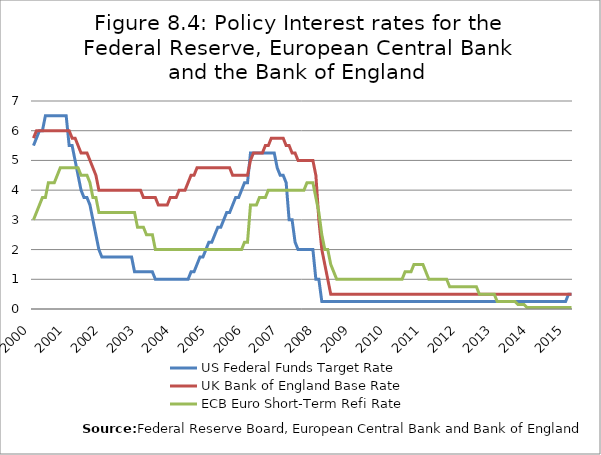
| Category | US Federal Funds Target Rate  | UK Bank of England Base Rate  | ECB Euro Short-Term Refi Rate   |
|---|---|---|---|
| 2000 | 5.5 | 5.75 | 3 |
| 2000 | 5.75 | 6 | 3.25 |
| 2000 | 6 | 6 | 3.5 |
| 2000 | 6 | 6 | 3.75 |
| 2000 | 6.5 | 6 | 3.75 |
| 2000 | 6.5 | 6 | 4.25 |
| 2000 | 6.5 | 6 | 4.25 |
| 2000 | 6.5 | 6 | 4.25 |
| 2000 | 6.5 | 6 | 4.5 |
| 2000 | 6.5 | 6 | 4.75 |
| 2000 | 6.5 | 6 | 4.75 |
| 2000 | 6.5 | 6 | 4.75 |
| 2001 | 5.5 | 6 | 4.75 |
| 2001 | 5.5 | 5.75 | 4.75 |
| 2001 | 5 | 5.75 | 4.75 |
| 2001 | 4.5 | 5.5 | 4.75 |
| 2001 | 4 | 5.25 | 4.5 |
| 2001 | 3.75 | 5.25 | 4.5 |
| 2001 | 3.75 | 5.25 | 4.5 |
| 2001 | 3.5 | 5 | 4.25 |
| 2001 | 3 | 4.75 | 3.75 |
| 2001 | 2.5 | 4.5 | 3.75 |
| 2001 | 2 | 4 | 3.25 |
| 2001 | 1.75 | 4 | 3.25 |
| 2002 | 1.75 | 4 | 3.25 |
| 2002 | 1.75 | 4 | 3.25 |
| 2002 | 1.75 | 4 | 3.25 |
| 2002 | 1.75 | 4 | 3.25 |
| 2002 | 1.75 | 4 | 3.25 |
| 2002 | 1.75 | 4 | 3.25 |
| 2002 | 1.75 | 4 | 3.25 |
| 2002 | 1.75 | 4 | 3.25 |
| 2002 | 1.75 | 4 | 3.25 |
| 2002 | 1.75 | 4 | 3.25 |
| 2002 | 1.25 | 4 | 3.25 |
| 2002 | 1.25 | 4 | 2.75 |
| 2003 | 1.25 | 4 | 2.75 |
| 2003 | 1.25 | 3.75 | 2.75 |
| 2003 | 1.25 | 3.75 | 2.5 |
| 2003 | 1.25 | 3.75 | 2.5 |
| 2003 | 1.25 | 3.75 | 2.5 |
| 2003 | 1 | 3.75 | 2 |
| 2003 | 1 | 3.5 | 2 |
| 2003 | 1 | 3.5 | 2 |
| 2003 | 1 | 3.5 | 2 |
| 2003 | 1 | 3.5 | 2 |
| 2003 | 1 | 3.75 | 2 |
| 2003 | 1 | 3.75 | 2 |
| 2004 | 1 | 3.75 | 2 |
| 2004 | 1 | 4 | 2 |
| 2004 | 1 | 4 | 2 |
| 2004 | 1 | 4 | 2 |
| 2004 | 1 | 4.25 | 2 |
| 2004 | 1.25 | 4.5 | 2 |
| 2004 | 1.25 | 4.5 | 2 |
| 2004 | 1.5 | 4.75 | 2 |
| 2004 | 1.75 | 4.75 | 2 |
| 2004 | 1.75 | 4.75 | 2 |
| 2004 | 2 | 4.75 | 2 |
| 2004 | 2.25 | 4.75 | 2 |
| 2005 | 2.25 | 4.75 | 2 |
| 2005 | 2.5 | 4.75 | 2 |
| 2005 | 2.75 | 4.75 | 2 |
| 2005 | 2.75 | 4.75 | 2 |
| 2005 | 3 | 4.75 | 2 |
| 2005 | 3.25 | 4.75 | 2 |
| 2005 | 3.25 | 4.75 | 2 |
| 2005 | 3.5 | 4.5 | 2 |
| 2005 | 3.75 | 4.5 | 2 |
| 2005 | 3.75 | 4.5 | 2 |
| 2005 | 4 | 4.5 | 2 |
| 2005 | 4.25 | 4.5 | 2.25 |
| 2006 | 4.25 | 4.5 | 2.25 |
| 2006 | 5.25 | 5 | 3.5 |
| 2007 | 5.25 | 5.25 | 3.5 |
| 2007 | 5.25 | 5.25 | 3.5 |
| 2007 | 5.25 | 5.25 | 3.75 |
| 2007 | 5.25 | 5.25 | 3.75 |
| 2007 | 5.25 | 5.5 | 3.75 |
| 2007 | 5.25 | 5.5 | 4 |
| 2007 | 5.25 | 5.75 | 4 |
| 2007 | 5.25 | 5.75 | 4 |
| 2007 | 4.75 | 5.75 | 4 |
| 2007 | 4.5 | 5.75 | 4 |
| 2007 | 4.5 | 5.75 | 4 |
| 2007 | 4.25 | 5.5 | 4 |
| 2008 | 3 | 5.5 | 4 |
| 2008 | 3 | 5.25 | 4 |
| 2008 | 2.25 | 5.25 | 4 |
| 2008 | 2 | 5 | 4 |
| 2008 | 2 | 5 | 4 |
| 2008 | 2 | 5 | 4 |
| 2008 | 2 | 5 | 4.25 |
| 2008 | 2 | 5 | 4.25 |
| 2008 | 2 | 5 | 4.25 |
| 2008 | 1 | 4.5 | 3.75 |
| 2008 | 1 | 3 | 3.25 |
| 2008 | 0.25 | 2 | 2.5 |
| 2009 | 0.25 | 1.5 | 2 |
| 2009 | 0.25 | 1 | 2 |
| 2009 | 0.25 | 0.5 | 1.5 |
| 2009 | 0.25 | 0.5 | 1.25 |
| 2009 | 0.25 | 0.5 | 1 |
| 2009 | 0.25 | 0.5 | 1 |
| 2009 | 0.25 | 0.5 | 1 |
| 2009 | 0.25 | 0.5 | 1 |
| 2009 | 0.25 | 0.5 | 1 |
| 2009 | 0.25 | 0.5 | 1 |
| 2009 | 0.25 | 0.5 | 1 |
| 2009 | 0.25 | 0.5 | 1 |
| 2010 | 0.25 | 0.5 | 1 |
| 2010 | 0.25 | 0.5 | 1 |
| 2010 | 0.25 | 0.5 | 1 |
| 2010 | 0.25 | 0.5 | 1 |
| 2010 | 0.25 | 0.5 | 1 |
| 2010 | 0.25 | 0.5 | 1 |
| 2010 | 0.25 | 0.5 | 1 |
| 2010 | 0.25 | 0.5 | 1 |
| 2010 | 0.25 | 0.5 | 1 |
| 2010 | 0.25 | 0.5 | 1 |
| 2010 | 0.25 | 0.5 | 1 |
| 2010 | 0.25 | 0.5 | 1 |
| 2011 | 0.25 | 0.5 | 1 |
| 2011 | 0.25 | 0.5 | 1 |
| 2011 | 0.25 | 0.5 | 1 |
| 2011 | 0.25 | 0.5 | 1.25 |
| 2011 | 0.25 | 0.5 | 1.25 |
| 2011 | 0.25 | 0.5 | 1.25 |
| 2011 | 0.25 | 0.5 | 1.5 |
| 2011 | 0.25 | 0.5 | 1.5 |
| 2011 | 0.25 | 0.5 | 1.5 |
| 2011 | 0.25 | 0.5 | 1.5 |
| 2011 | 0.25 | 0.5 | 1.25 |
| 2011 | 0.25 | 0.5 | 1 |
| 2012 | 0.25 | 0.5 | 1 |
| 2012 | 0.25 | 0.5 | 1 |
| 2012 | 0.25 | 0.5 | 1 |
| 2012 | 0.25 | 0.5 | 1 |
| 2012 | 0.25 | 0.5 | 1 |
| 2012 | 0.25 | 0.5 | 1 |
| 2012 | 0.25 | 0.5 | 0.75 |
| 2012 | 0.25 | 0.5 | 0.75 |
| 2012 | 0.25 | 0.5 | 0.75 |
| 2012 | 0.25 | 0.5 | 0.75 |
| 2012 | 0.25 | 0.5 | 0.75 |
| 2012 | 0.25 | 0.5 | 0.75 |
| 2013 | 0.25 | 0.5 | 0.75 |
| 2013 | 0.25 | 0.5 | 0.75 |
| 2013 | 0.25 | 0.5 | 0.75 |
| 2013 | 0.25 | 0.5 | 0.75 |
| 2013 | 0.25 | 0.5 | 0.5 |
| 2013 | 0.25 | 0.5 | 0.5 |
| 2013 | 0.25 | 0.5 | 0.5 |
| 2013 | 0.25 | 0.5 | 0.5 |
| 2013 | 0.25 | 0.5 | 0.5 |
| 2013 | 0.25 | 0.5 | 0.5 |
| 2013 | 0.25 | 0.5 | 0.25 |
| 2013 | 0.25 | 0.5 | 0.25 |
| 2014 | 0.25 | 0.5 | 0.25 |
| 2014 | 0.25 | 0.5 | 0.25 |
| 2014 | 0.25 | 0.5 | 0.25 |
| 2014 | 0.25 | 0.5 | 0.25 |
| 2014 | 0.25 | 0.5 | 0.25 |
| 2014 | 0.25 | 0.5 | 0.15 |
| 2014 | 0.25 | 0.5 | 0.15 |
| 2014 | 0.25 | 0.5 | 0.15 |
| 2014 | 0.25 | 0.5 | 0.05 |
| 2014 | 0.25 | 0.5 | 0.05 |
| 2014 | 0.25 | 0.5 | 0.05 |
| 2014 | 0.25 | 0.5 | 0.05 |
| 2015 | 0.25 | 0.5 | 0.05 |
| 2015 | 0.25 | 0.5 | 0.05 |
| 2015 | 0.25 | 0.5 | 0.05 |
| 2015 | 0.25 | 0.5 | 0.05 |
| 2015 | 0.25 | 0.5 | 0.05 |
| 2015 | 0.25 | 0.5 | 0.05 |
| 2015 | 0.25 | 0.5 | 0.05 |
| 2015 | 0.25 | 0.5 | 0.05 |
| 2015 | 0.25 | 0.5 | 0.05 |
| 2015 | 0.25 | 0.5 | 0.05 |
| 2015 | 0.5 | 0.5 | 0.05 |
| 2015 | 0.5 | 0.5 | 0.05 |